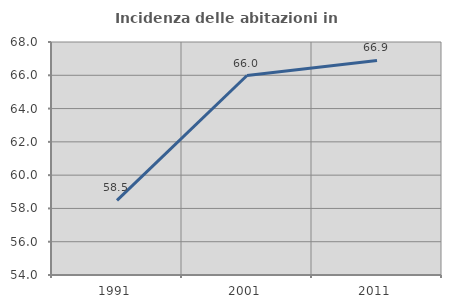
| Category | Incidenza delle abitazioni in proprietà  |
|---|---|
| 1991.0 | 58.485 |
| 2001.0 | 65.987 |
| 2011.0 | 66.89 |